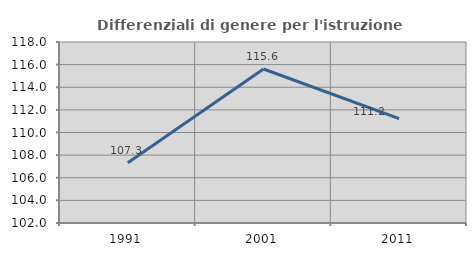
| Category | Differenziali di genere per l'istruzione superiore |
|---|---|
| 1991.0 | 107.317 |
| 2001.0 | 115.612 |
| 2011.0 | 111.22 |